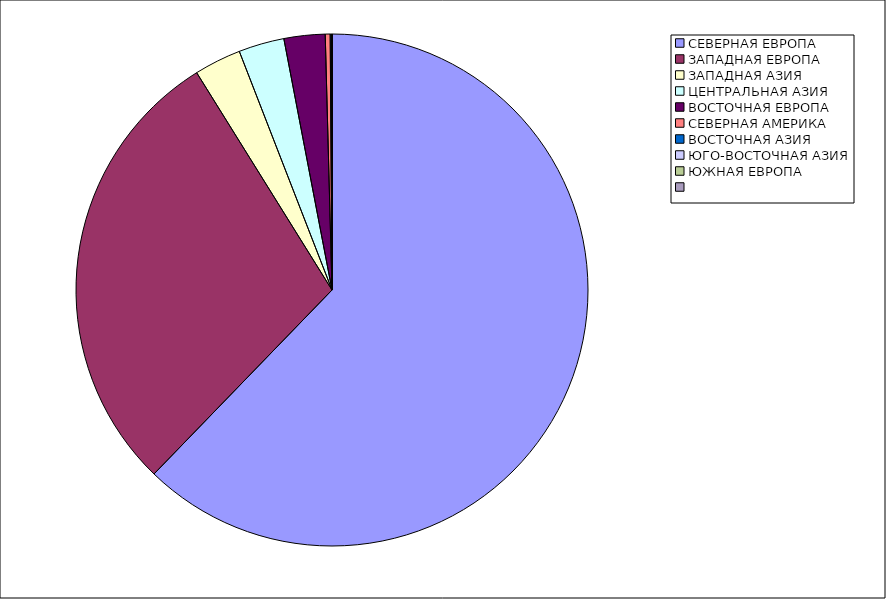
| Category | Оборот |
|---|---|
| СЕВЕРНАЯ ЕВРОПА | 62.237 |
| ЗАПАДНАЯ ЕВРОПА | 28.898 |
| ЗАПАДНАЯ АЗИЯ | 2.969 |
| ЦЕНТРАЛЬНАЯ АЗИЯ | 2.882 |
| ВОСТОЧНАЯ ЕВРОПА | 2.592 |
| СЕВЕРНАЯ АМЕРИКА | 0.31 |
| ВОСТОЧНАЯ АЗИЯ | 0.109 |
| ЮГО-ВОСТОЧНАЯ АЗИЯ | 0.002 |
| ЮЖНАЯ ЕВРОПА | 0.001 |